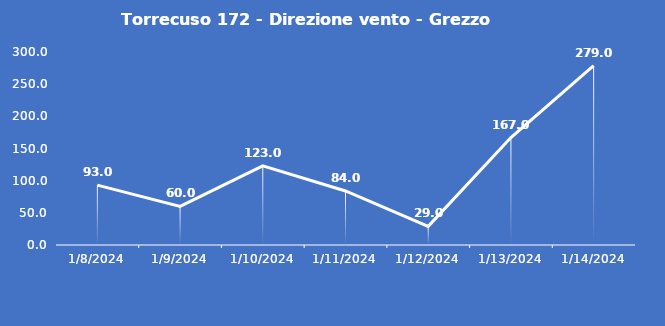
| Category | Torrecuso 172 - Direzione vento - Grezzo (°N) |
|---|---|
| 1/8/24 | 93 |
| 1/9/24 | 60 |
| 1/10/24 | 123 |
| 1/11/24 | 84 |
| 1/12/24 | 29 |
| 1/13/24 | 167 |
| 1/14/24 | 279 |